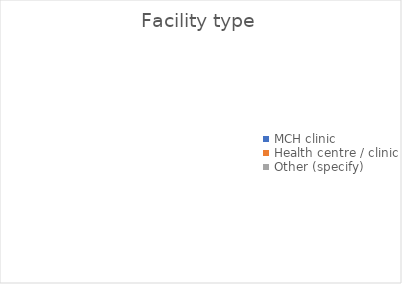
| Category | Series 0 |
|---|---|
| MCH clinic | 0 |
| Health centre / clinic | 0 |
| Other (specify) | 0 |